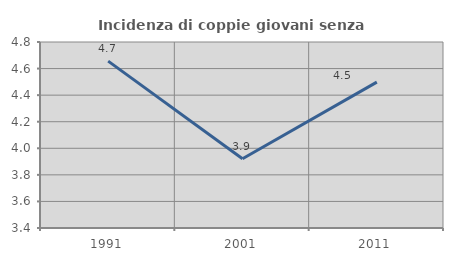
| Category | Incidenza di coppie giovani senza figli |
|---|---|
| 1991.0 | 4.656 |
| 2001.0 | 3.922 |
| 2011.0 | 4.498 |